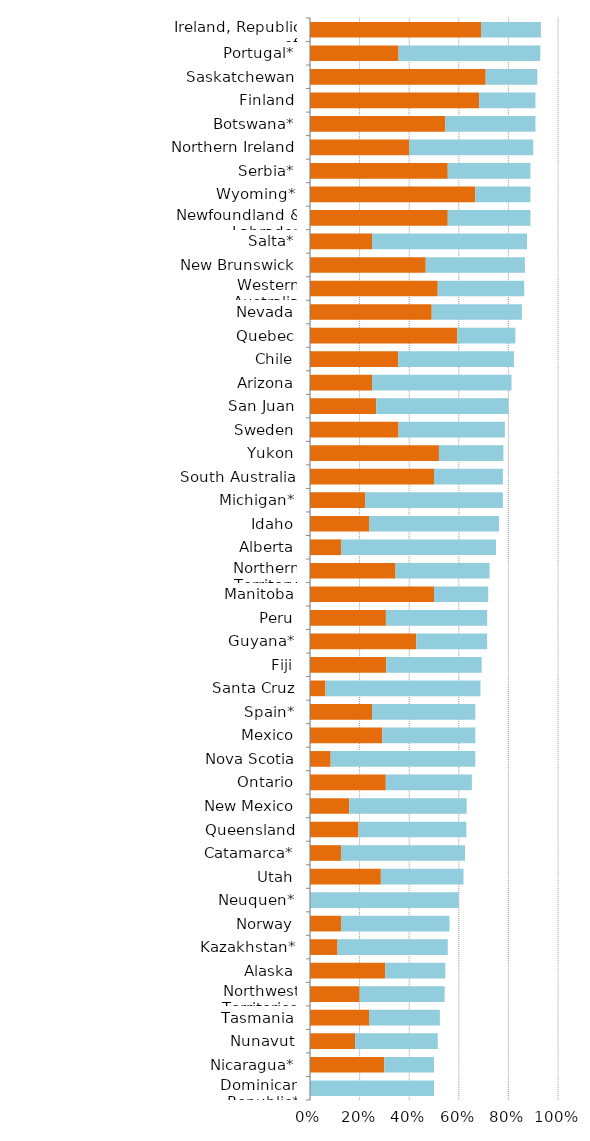
| Category | Encourages Investment | Not a Deterrent to Investment |
|---|---|---|
| Dominican Republic* | 0 | 0.5 |
| Nicaragua* | 0.3 | 0.2 |
| Nunavut | 0.182 | 0.333 |
| Tasmania | 0.238 | 0.286 |
| Northwest Territories | 0.2 | 0.343 |
| Alaska | 0.303 | 0.242 |
| Kazakhstan* | 0.111 | 0.444 |
| Norway | 0.125 | 0.438 |
| Neuquen* | 0 | 0.6 |
| Utah | 0.286 | 0.333 |
| Catamarca* | 0.125 | 0.5 |
| Queensland | 0.196 | 0.435 |
| New Mexico | 0.158 | 0.474 |
| Ontario | 0.306 | 0.347 |
| Nova Scotia | 0.083 | 0.583 |
| Mexico | 0.292 | 0.375 |
| Spain* | 0.25 | 0.417 |
| Santa Cruz | 0.062 | 0.625 |
| Fiji | 0.308 | 0.385 |
| Guyana* | 0.429 | 0.286 |
| Peru | 0.306 | 0.408 |
| Manitoba | 0.5 | 0.219 |
| Northern Territory | 0.345 | 0.379 |
| Alberta | 0.125 | 0.625 |
| Idaho | 0.238 | 0.524 |
| Michigan* | 0.222 | 0.556 |
| South Australia | 0.5 | 0.278 |
| Yukon | 0.52 | 0.26 |
| Sweden | 0.357 | 0.429 |
| San Juan | 0.267 | 0.533 |
| Arizona | 0.25 | 0.562 |
| Chile | 0.356 | 0.467 |
| Quebec | 0.594 | 0.234 |
| Nevada | 0.491 | 0.364 |
| Western Australia | 0.515 | 0.348 |
| New Brunswick | 0.467 | 0.4 |
| Salta* | 0.25 | 0.625 |
| Newfoundland & Labrador | 0.556 | 0.333 |
| Wyoming* | 0.667 | 0.222 |
| Serbia* | 0.556 | 0.333 |
| Northern Ireland | 0.4 | 0.5 |
| Botswana* | 0.545 | 0.364 |
| Finland | 0.682 | 0.227 |
| Saskatchewan | 0.708 | 0.208 |
| Portugal* | 0.357 | 0.571 |
| Ireland, Republic of | 0.69 | 0.241 |